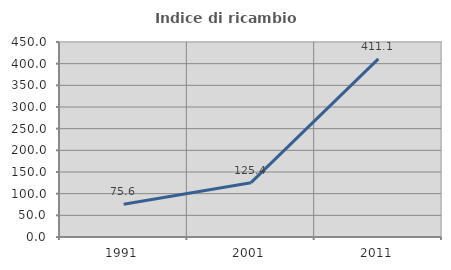
| Category | Indice di ricambio occupazionale  |
|---|---|
| 1991.0 | 75.581 |
| 2001.0 | 125.373 |
| 2011.0 | 411.111 |